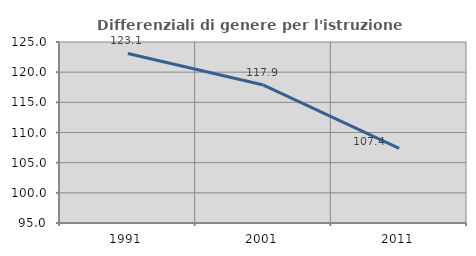
| Category | Differenziali di genere per l'istruzione superiore |
|---|---|
| 1991.0 | 123.101 |
| 2001.0 | 117.867 |
| 2011.0 | 107.374 |